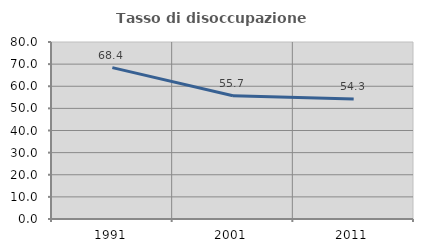
| Category | Tasso di disoccupazione giovanile  |
|---|---|
| 1991.0 | 68.421 |
| 2001.0 | 55.714 |
| 2011.0 | 54.286 |